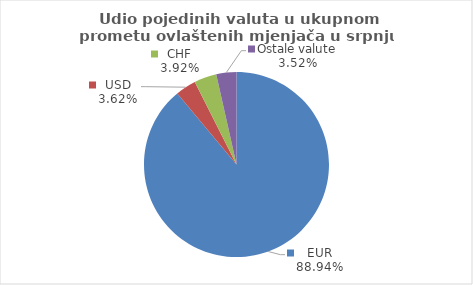
| Category | Series 0 |
|---|---|
| EUR | 88.941 |
| USD | 3.618 |
| CHF | 3.919 |
| Ostale valute | 3.522 |